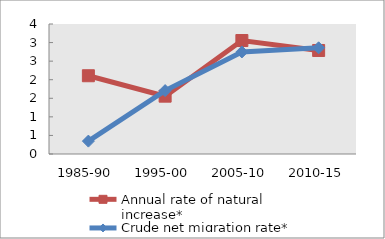
| Category | Annual rate of natural increase* | Crude net migration rate* |
|---|---|---|
| 1985-90 | 2.107 | 0.347 |
| 1995-00 | 1.557 | 1.707 |
| 2005-10 | 3.055 | 2.747 |
| 2010-15 | 2.787 | 2.859 |